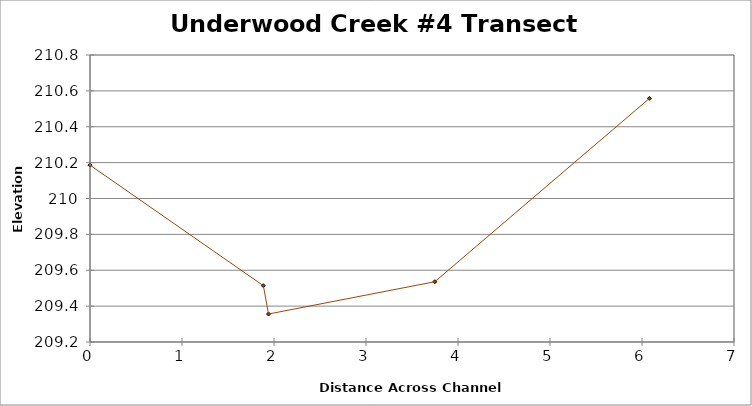
| Category | Series 0 |
|---|---|
| 0.0 | 210.186 |
| 1.8842879294481747 | 209.514 |
| 1.9404020198851692 | 209.356 |
| 3.74824785733558 | 209.536 |
| 6.080745102257468 | 210.558 |